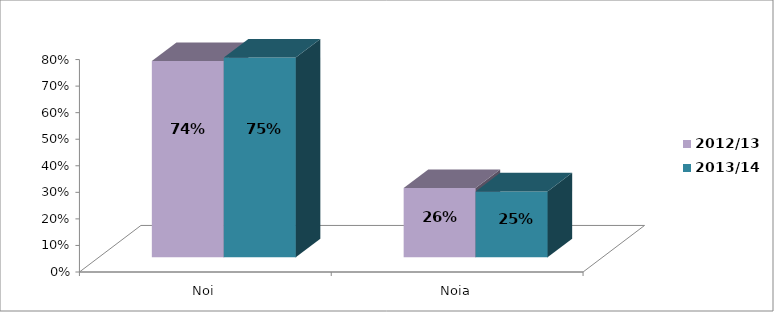
| Category | 2012/13 | 2013/14 |
|---|---|---|
| Noi | 0.739 | 0.752 |
| Noia | 0.261 | 0.248 |